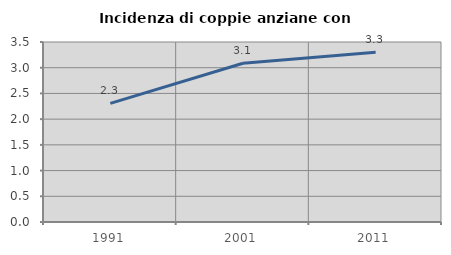
| Category | Incidenza di coppie anziane con figli |
|---|---|
| 1991.0 | 2.307 |
| 2001.0 | 3.086 |
| 2011.0 | 3.3 |